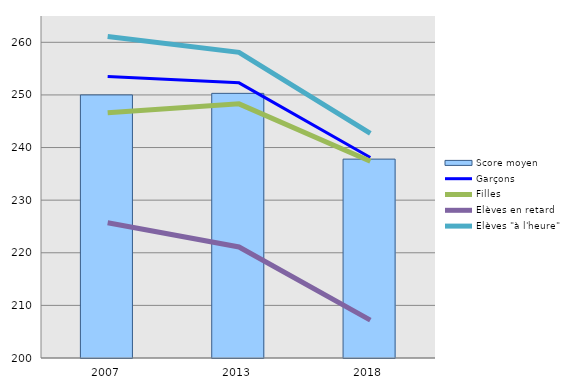
| Category | Score moyen |
|---|---|
| 2007 | 250 |
| 2013 | 250.3 |
| 2018 | 237.8 |